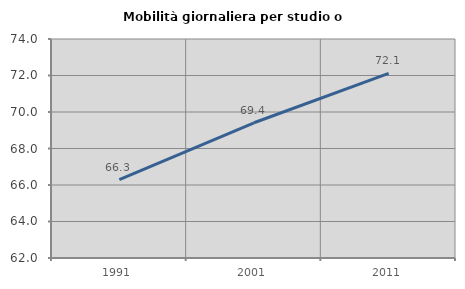
| Category | Mobilità giornaliera per studio o lavoro |
|---|---|
| 1991.0 | 66.3 |
| 2001.0 | 69.41 |
| 2011.0 | 72.113 |